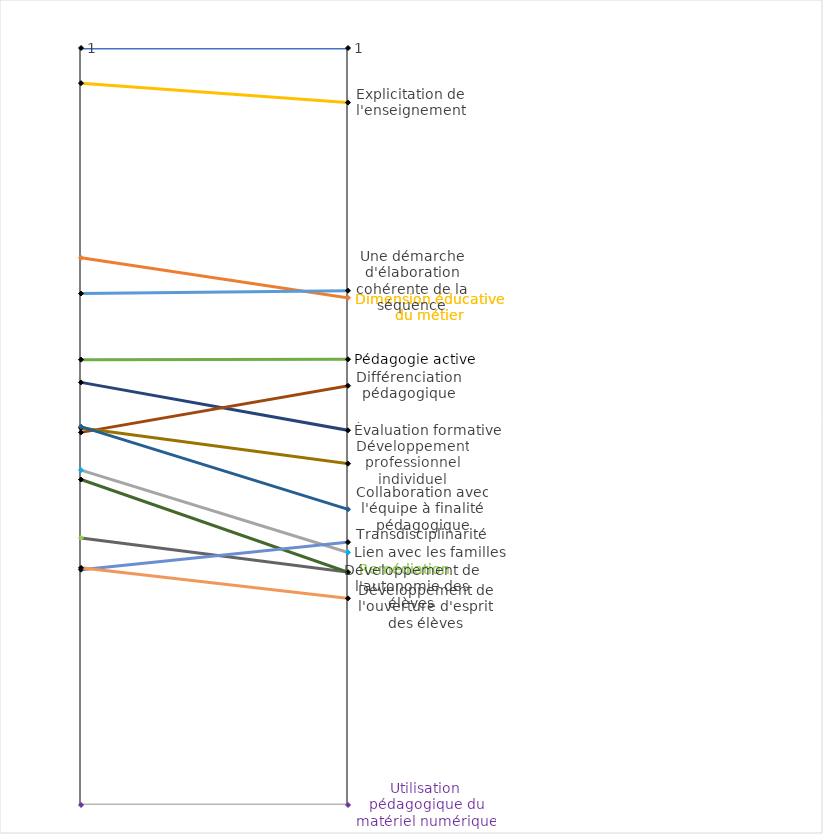
| Category | Collaboration avec l'équipe à finalité éducative | Dimension éducative du métier | Lien avec les familles | Explicitation de l'enseignement | Une démarche d'élaboration cohérente de la séquence | Pédagogie active | Évaluation formative | Différenciation pédagogique | Remédiation | Développement professionnel individuel | Collaboration avec l'équipe à finalité pédagogique | Développement de l'autonomie des élèves | Transdisciplinarité | Développement de l'ouverture d'esprit des élèves | Utilisation pédagogique du matériel numérique |
|---|---|---|---|---|---|---|---|---|---|---|---|---|---|---|---|
| Classe de niveau élevé | 1 | 0.723 | 0.442 | 0.954 | 0.676 | 0.588 | 0.558 | 0.492 | 0.353 | 0.498 | 0.5 | 0.43 | 0.311 | 0.313 | 0 |
| Classe de niveau faible | 1 | 0.67 | 0.334 | 0.928 | 0.679 | 0.589 | 0.495 | 0.554 | 0.308 | 0.451 | 0.391 | 0.307 | 0.347 | 0.273 | 0 |